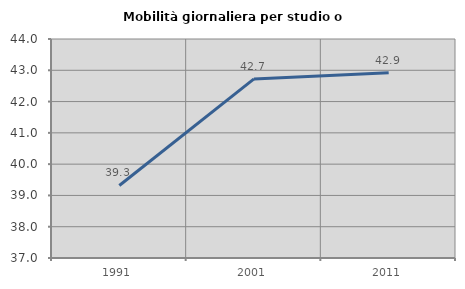
| Category | Mobilità giornaliera per studio o lavoro |
|---|---|
| 1991.0 | 39.318 |
| 2001.0 | 42.724 |
| 2011.0 | 42.924 |